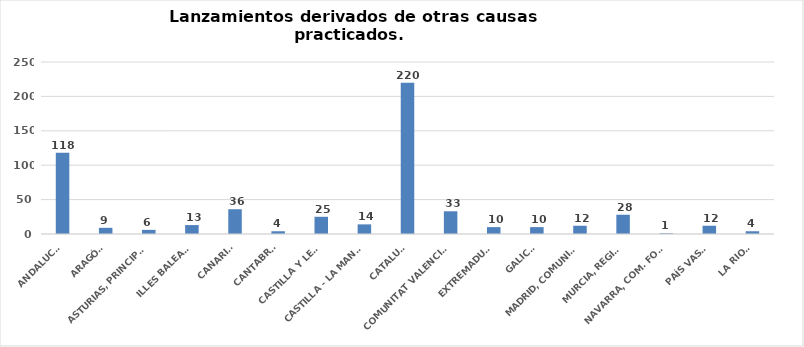
| Category | Series 0 |
|---|---|
| ANDALUCÍA | 118 |
| ARAGÓN | 9 |
| ASTURIAS, PRINCIPADO | 6 |
| ILLES BALEARS | 13 |
| CANARIAS | 36 |
| CANTABRIA | 4 |
| CASTILLA Y LEÓN | 25 |
| CASTILLA - LA MANCHA | 14 |
| CATALUÑA | 220 |
| COMUNITAT VALENCIANA | 33 |
| EXTREMADURA | 10 |
| GALICIA | 10 |
| MADRID, COMUNIDAD | 12 |
| MURCIA, REGIÓN | 28 |
| NAVARRA, COM. FORAL | 1 |
| PAÍS VASCO | 12 |
| LA RIOJA | 4 |